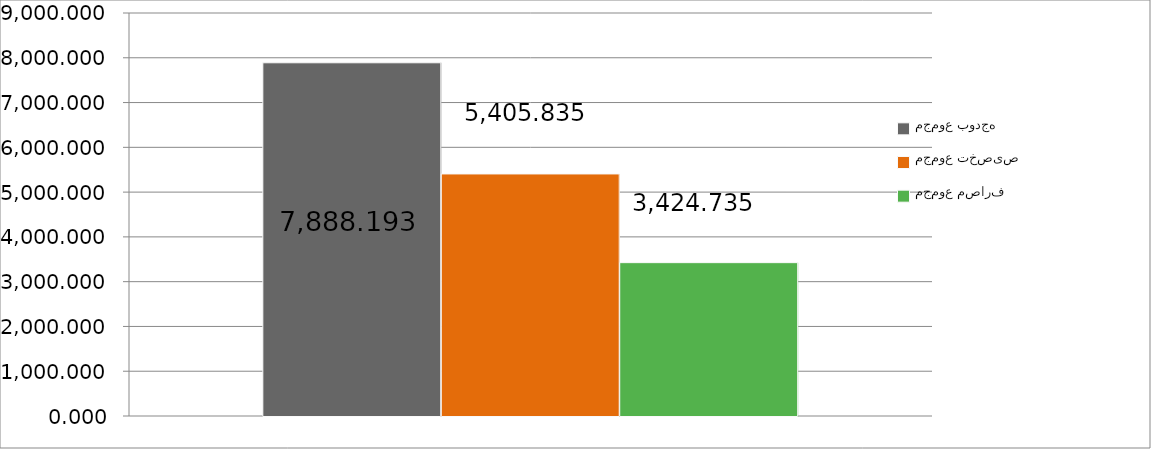
| Category | مجموع بودجه  | مجموع تخصیص | مجموع مصارف |
|---|---|---|---|
| 0 | 7888.193 | 5405.835 | 3424.735 |